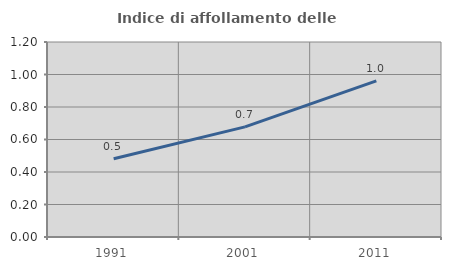
| Category | Indice di affollamento delle abitazioni  |
|---|---|
| 1991.0 | 0.481 |
| 2001.0 | 0.678 |
| 2011.0 | 0.961 |